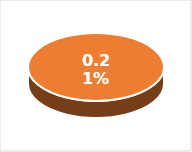
| Category | Series 0 |
|---|---|
| 0 | 0.002 |